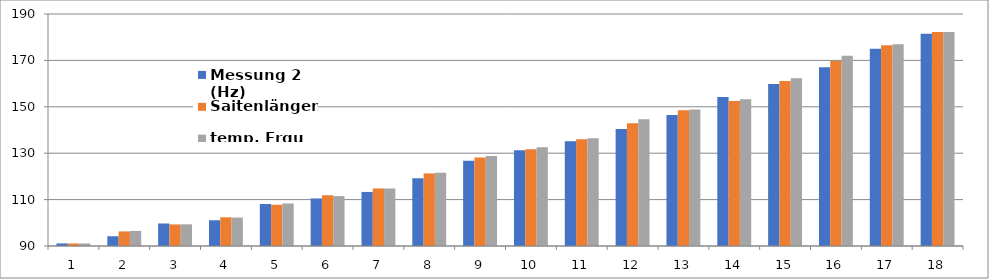
| Category | Messung 2 (Hz) | Saitenlängen | temp. Frqu |
|---|---|---|---|
| 0 | 91.1 | 91.1 | 91.1 |
| 1 | 94.2 | 96.29 | 96.517 |
| 2 | 99.7 | 99.299 | 99.345 |
| 3 | 101.1 | 102.37 | 102.256 |
| 4 | 108.1 | 107.787 | 108.337 |
| 5 | 110.5 | 111.886 | 111.511 |
| 6 | 113.3 | 114.797 | 114.779 |
| 7 | 119.2 | 121.281 | 121.604 |
| 8 | 126.75 | 128.128 | 128.835 |
| 9 | 131.3 | 131.74 | 132.61 |
| 10 | 135.2 | 136.026 | 136.496 |
| 11 | 140.4 | 142.876 | 144.612 |
| 12 | 146.5 | 148.484 | 148.85 |
| 13 | 154.2 | 152.474 | 153.211 |
| 14 | 159.8 | 161.134 | 162.322 |
| 15 | 167 | 169.742 | 171.974 |
| 16 | 175 | 176.532 | 177.013 |
| 17 | 181.5 | 182.2 | 182.2 |